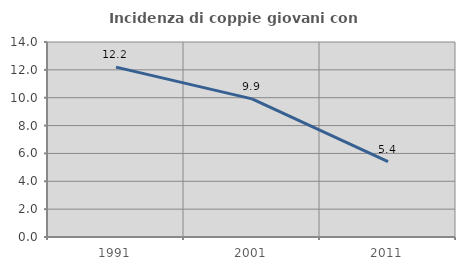
| Category | Incidenza di coppie giovani con figli |
|---|---|
| 1991.0 | 12.195 |
| 2001.0 | 9.917 |
| 2011.0 | 5.405 |